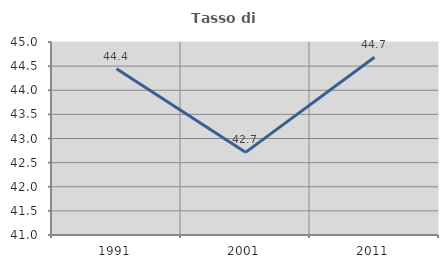
| Category | Tasso di occupazione   |
|---|---|
| 1991.0 | 44.444 |
| 2001.0 | 42.713 |
| 2011.0 | 44.685 |